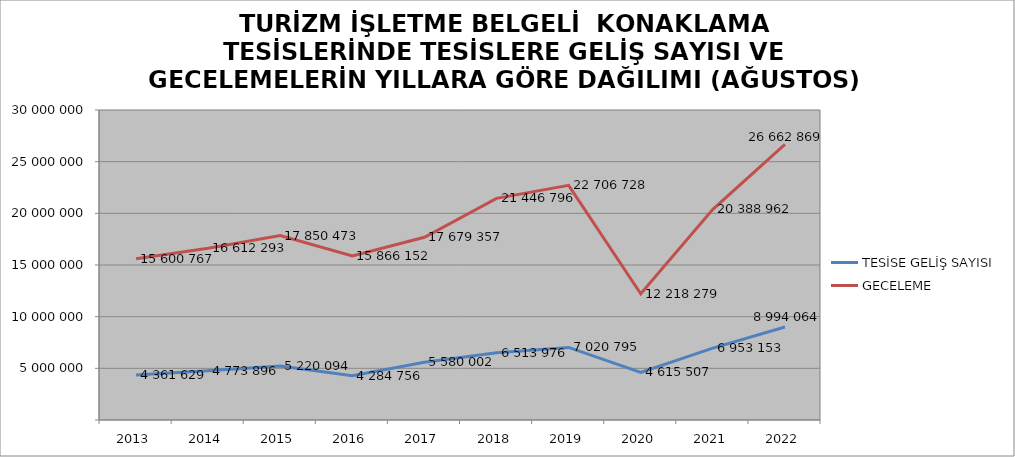
| Category | TESİSE GELİŞ SAYISI | GECELEME |
|---|---|---|
| 2013 | 4361629 | 15600767 |
| 2014 | 4773896 | 16612293 |
| 2015 | 5220094 | 17850473 |
| 2016 | 4284756 | 15866152 |
| 2017 | 5580002 | 17679357 |
| 2018 | 6513976 | 21446796 |
| 2019 | 7020795 | 22706728 |
| 2020 | 4615507 | 12218279 |
| 2021 | 6953153 | 20388962 |
| 2022 | 8994064 | 26662869 |